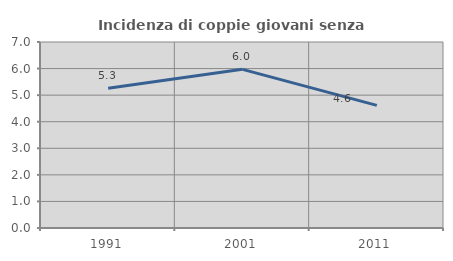
| Category | Incidenza di coppie giovani senza figli |
|---|---|
| 1991.0 | 5.262 |
| 2001.0 | 5.971 |
| 2011.0 | 4.615 |